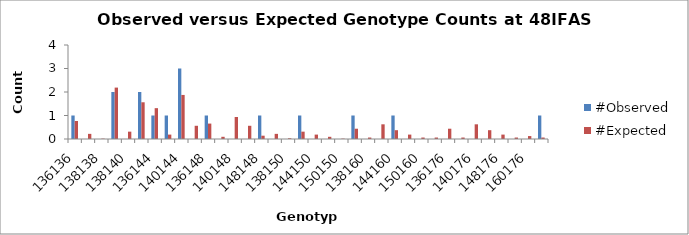
| Category | #Observed | #Expected |
|---|---|---|
| 136136.0 | 1 | 0.766 |
| 136138.0 | 0 | 0.219 |
| 138138.0 | 0 | 0.016 |
| 136140.0 | 2 | 2.188 |
| 138140.0 | 0 | 0.312 |
| 140140.0 | 2 | 1.562 |
| 136144.0 | 1 | 1.312 |
| 138144.0 | 1 | 0.188 |
| 140144.0 | 3 | 1.875 |
| 144144.0 | 0 | 0.562 |
| 136148.0 | 1 | 0.656 |
| 138148.0 | 0 | 0.094 |
| 140148.0 | 0 | 0.938 |
| 144148.0 | 0 | 0.562 |
| 148148.0 | 1 | 0.141 |
| 136150.0 | 0 | 0.219 |
| 138150.0 | 0 | 0.031 |
| 140150.0 | 1 | 0.312 |
| 144150.0 | 0 | 0.188 |
| 148150.0 | 0 | 0.094 |
| 150150.0 | 0 | 0.016 |
| 136160.0 | 1 | 0.438 |
| 138160.0 | 0 | 0.062 |
| 140160.0 | 0 | 0.625 |
| 144160.0 | 1 | 0.375 |
| 148160.0 | 0 | 0.188 |
| 150160.0 | 0 | 0.062 |
| 160160.0 | 0 | 0.062 |
| 136176.0 | 0 | 0.438 |
| 138176.0 | 0 | 0.062 |
| 140176.0 | 0 | 0.625 |
| 144176.0 | 0 | 0.375 |
| 148176.0 | 0 | 0.188 |
| 150176.0 | 0 | 0.062 |
| 160176.0 | 0 | 0.125 |
| 176176.0 | 1 | 0.062 |